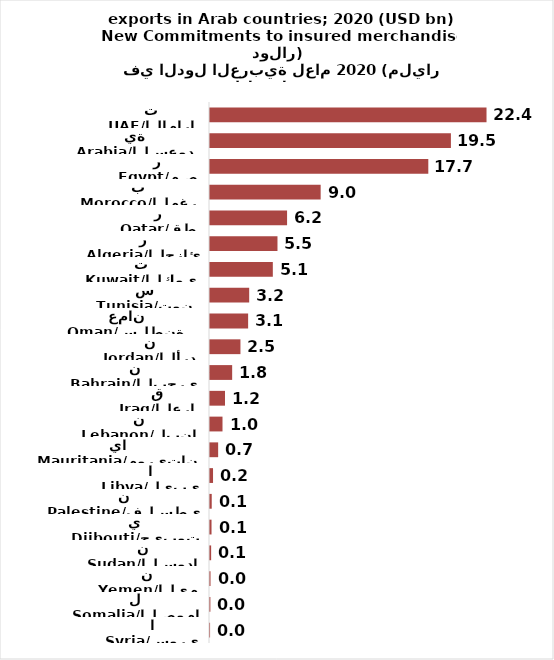
| Category | Series 0 |
|---|---|
| UAE/الامارات | 22.372 |
| Saudi Arabia/السعودية | 19.491 |
| Egypt/مصر | 17.662 |
| Morocco/المغرب | 8.953 |
| Qatar/قطر | 6.236 |
| Algeria/الجزائر | 5.46 |
| Kuwait/الكويت | 5.083 |
| Tunisia/تونس | 3.171 |
| Oman/سلطنة عمان | 3.085 |
| Jordan/الأردن | 2.463 |
| Bahrain/البحرين | 1.793 |
| Iraq/العراق | 1.213 |
| Lebanon/لبنان | 1.012 |
| Mauritania/موريتانيا | 0.659 |
| Libya/ليبيا | 0.245 |
| Palestine/فلسطين | 0.14 |
| Djibouti/جيبوتي | 0.123 |
| Sudan/السودان | 0.092 |
| Yemen/اليمن | 0.042 |
| Somalia/الصومال | 0.031 |
| Syria/سوريا | 0.005 |